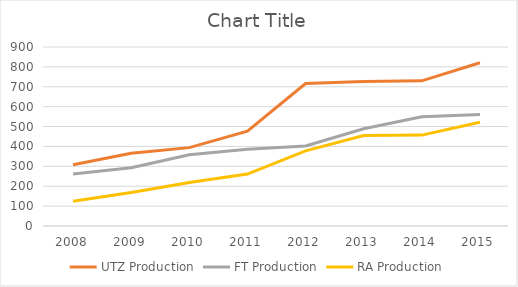
| Category | UTZ Production | FT Production | RA Production |
|---|---|---|---|
| 2008.0 | 308 | 261 | 124 |
| 2009.0 | 366 | 293 | 168 |
| 2010.0 | 394 | 358 | 219 |
| 2011.0 | 477 | 386 | 261 |
| 2012.0 | 716 | 402 | 378 |
| 2013.0 | 727 | 489 | 455 |
| 2014.0 | 730 | 549 | 457 |
| 2015.0 | 821 | 561 | 522 |